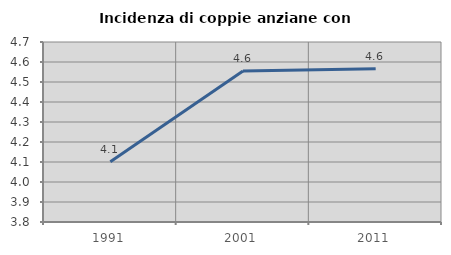
| Category | Incidenza di coppie anziane con figli |
|---|---|
| 1991.0 | 4.102 |
| 2001.0 | 4.555 |
| 2011.0 | 4.566 |